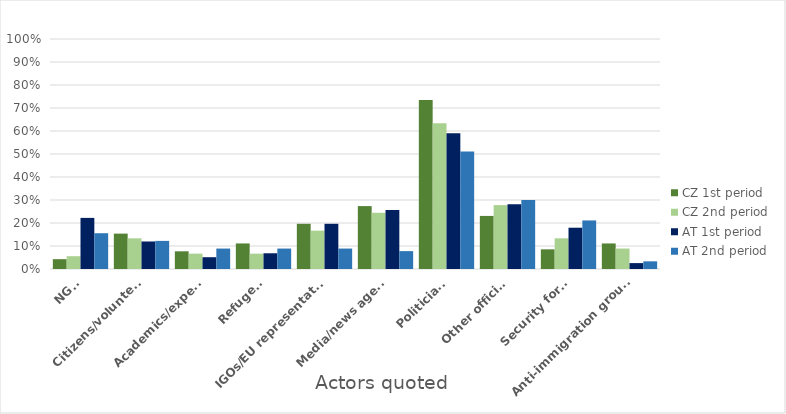
| Category | CZ 1st period | CZ 2nd period | AT 1st period | AT 2nd period |
|---|---|---|---|---|
| NGOs | 0.043 | 0.056 | 0.222 | 0.156 |
| Citizens/volunteers | 0.154 | 0.133 | 0.12 | 0.122 |
| Academics/experts | 0.077 | 0.067 | 0.051 | 0.089 |
| Refugees | 0.111 | 0.067 | 0.068 | 0.089 |
| IGOs/EU representatives | 0.197 | 0.167 | 0.197 | 0.089 |
| Media/news agency | 0.274 | 0.244 | 0.256 | 0.078 |
| Politicians | 0.735 | 0.633 | 0.59 | 0.511 |
| Other officials | 0.231 | 0.278 | 0.282 | 0.3 |
| Security forces | 0.085 | 0.133 | 0.179 | 0.211 |
| Anti-immigration groups/politicians | 0.111 | 0.089 | 0.026 | 0.033 |